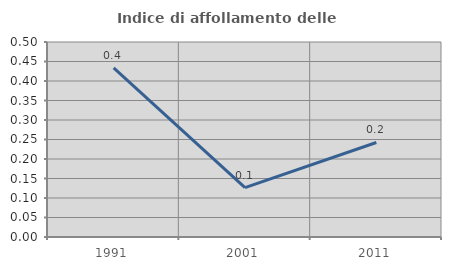
| Category | Indice di affollamento delle abitazioni  |
|---|---|
| 1991.0 | 0.434 |
| 2001.0 | 0.127 |
| 2011.0 | 0.242 |